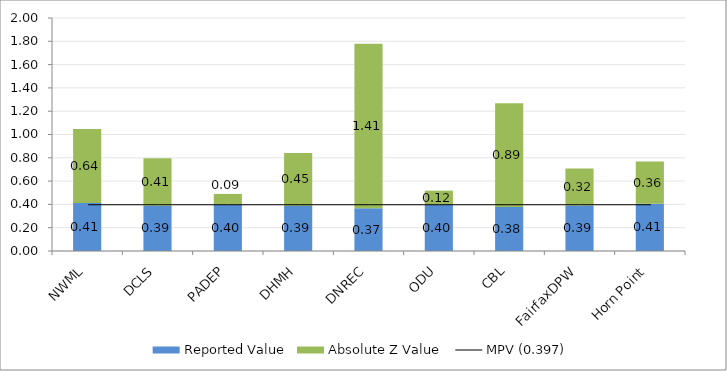
| Category | Reported Value | Absolute Z Value  |
|---|---|---|
| NWML | 0.411 | 0.636 |
| DCLS | 0.388 | 0.409 |
| PADEP | 0.399 | 0.091 |
| DHMH | 0.387 | 0.455 |
| DNREC | 0.366 | 1.414 |
| ODU | 0.4 | 0.118 |
| CBL | 0.377 | 0.891 |
| FairfaxDPW | 0.39 | 0.318 |
| Horn Point | 0.405 | 0.364 |